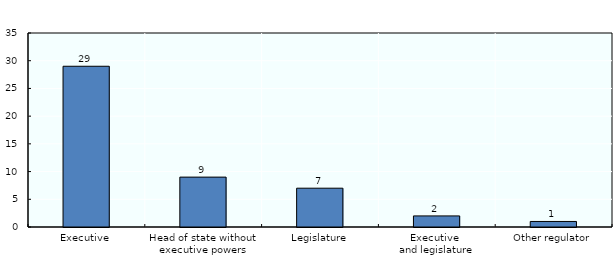
| Category | Who makes the final decision on appointment of board? |
|---|---|
| Executive | 29 |
| Head of state without executive powers | 9 |
| Legislature | 7 |
| Executive 
and legislature | 2 |
| Other regulator | 1 |